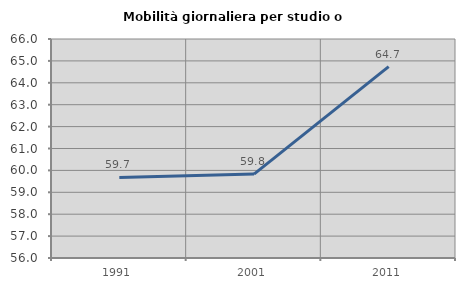
| Category | Mobilità giornaliera per studio o lavoro |
|---|---|
| 1991.0 | 59.678 |
| 2001.0 | 59.832 |
| 2011.0 | 64.741 |